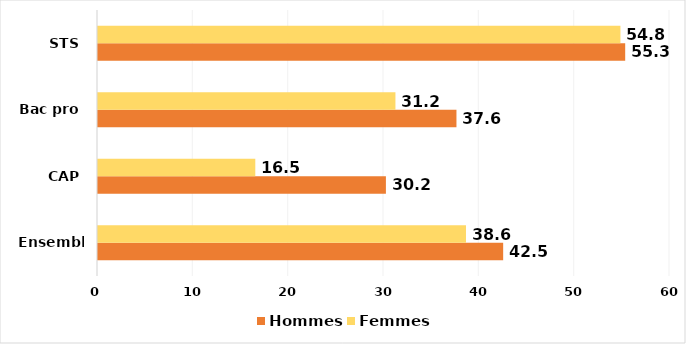
| Category | Hommes | Femmes |
|---|---|---|
| Ensemble | 42.5 | 38.6 |
| CAP | 30.2 | 16.5 |
| Bac pro | 37.6 | 31.2 |
| STS | 55.3 | 54.8 |